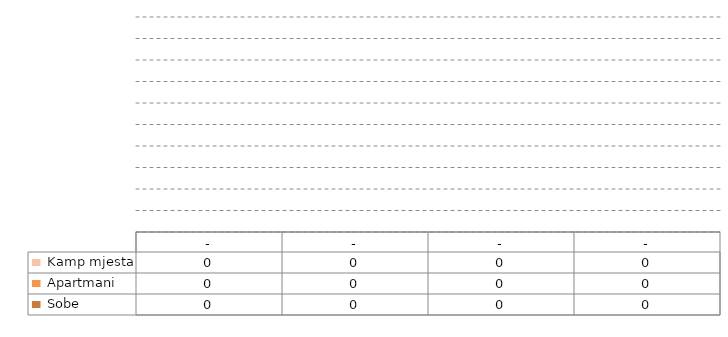
| Category |  Sobe |  Apartmani |  Kamp mjesta |
|---|---|---|---|
| - | 0 | 0 | 0 |
| - | 0 | 0 | 0 |
| - | 0 | 0 | 0 |
| - | 0 | 0 | 0 |